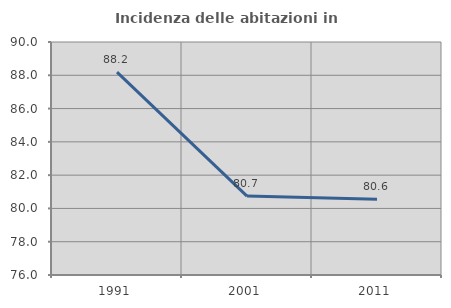
| Category | Incidenza delle abitazioni in proprietà  |
|---|---|
| 1991.0 | 88.19 |
| 2001.0 | 80.739 |
| 2011.0 | 80.558 |